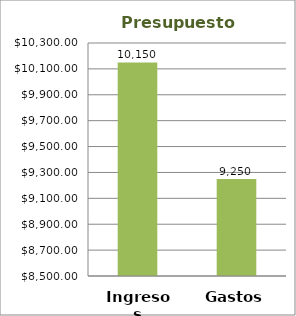
| Category | Series 0 |
|---|---|
| Ingresos | 10150 |
| Gastos | 9250 |